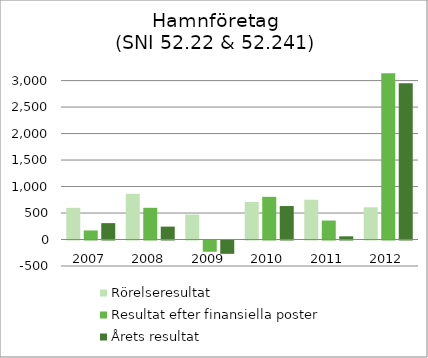
| Category | Rörelseresultat | Resultat efter finansiella poster | Årets resultat |
|---|---|---|---|
| 0 | 598 | 171 | 309.326 |
| 1 | 863.051 | 598.633 | 243.744 |
| 2 | 470.155 | -212.41 | -251.737 |
| 3 | 709.801 | 805.844 | 631.87 |
| 4 | 750.551 | 358.3 | 60.482 |
| 5 | 607.815 | 3138.647 | 2949.896 |